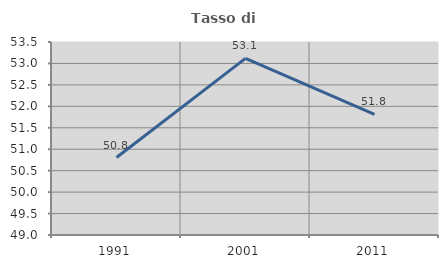
| Category | Tasso di occupazione   |
|---|---|
| 1991.0 | 50.806 |
| 2001.0 | 53.117 |
| 2011.0 | 51.815 |